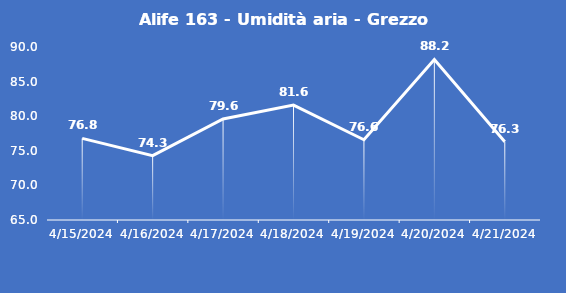
| Category | Alife 163 - Umidità aria - Grezzo (%) |
|---|---|
| 4/15/24 | 76.8 |
| 4/16/24 | 74.3 |
| 4/17/24 | 79.6 |
| 4/18/24 | 81.6 |
| 4/19/24 | 76.6 |
| 4/20/24 | 88.2 |
| 4/21/24 | 76.3 |